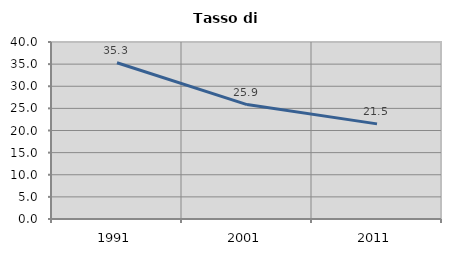
| Category | Tasso di disoccupazione   |
|---|---|
| 1991.0 | 35.321 |
| 2001.0 | 25.858 |
| 2011.0 | 21.495 |